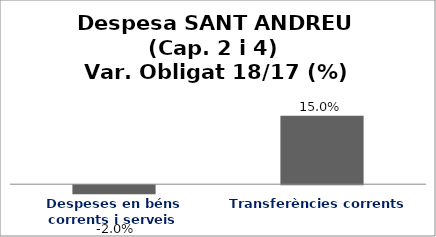
| Category | Series 0 |
|---|---|
| Despeses en béns corrents i serveis | -0.02 |
| Transferències corrents | 0.15 |